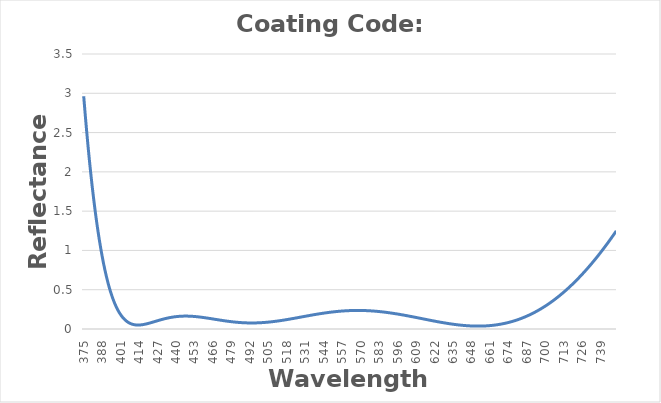
| Category | Reflectance |
|---|---|
| 375.0 | 2.962 |
| 376.0 | 2.742 |
| 377.0 | 2.533 |
| 378.0 | 2.336 |
| 379.0 | 2.15 |
| 380.0 | 1.975 |
| 381.0 | 1.81 |
| 382.0 | 1.656 |
| 383.0 | 1.512 |
| 384.0 | 1.377 |
| 385.0 | 1.251 |
| 386.0 | 1.134 |
| 387.0 | 1.025 |
| 388.0 | 0.925 |
| 389.0 | 0.831 |
| 390.0 | 0.746 |
| 391.0 | 0.667 |
| 392.0 | 0.594 |
| 393.0 | 0.528 |
| 394.0 | 0.468 |
| 395.0 | 0.413 |
| 396.0 | 0.363 |
| 397.0 | 0.318 |
| 398.0 | 0.278 |
| 399.0 | 0.242 |
| 400.0 | 0.21 |
| 401.0 | 0.182 |
| 402.0 | 0.157 |
| 403.0 | 0.136 |
| 404.0 | 0.117 |
| 405.0 | 0.102 |
| 406.0 | 0.089 |
| 407.0 | 0.078 |
| 408.0 | 0.069 |
| 409.0 | 0.062 |
| 410.0 | 0.057 |
| 411.0 | 0.053 |
| 412.0 | 0.051 |
| 413.0 | 0.05 |
| 414.0 | 0.051 |
| 415.0 | 0.052 |
| 416.0 | 0.054 |
| 417.0 | 0.057 |
| 418.0 | 0.06 |
| 419.0 | 0.064 |
| 420.0 | 0.069 |
| 421.0 | 0.074 |
| 422.0 | 0.079 |
| 423.0 | 0.084 |
| 424.0 | 0.089 |
| 425.0 | 0.095 |
| 426.0 | 0.1 |
| 427.0 | 0.105 |
| 428.0 | 0.111 |
| 429.0 | 0.116 |
| 430.0 | 0.121 |
| 431.0 | 0.126 |
| 432.0 | 0.13 |
| 433.0 | 0.135 |
| 434.0 | 0.139 |
| 435.0 | 0.143 |
| 436.0 | 0.146 |
| 437.0 | 0.15 |
| 438.0 | 0.152 |
| 439.0 | 0.155 |
| 440.0 | 0.157 |
| 441.0 | 0.159 |
| 442.0 | 0.161 |
| 443.0 | 0.162 |
| 444.0 | 0.163 |
| 445.0 | 0.164 |
| 446.0 | 0.164 |
| 447.0 | 0.164 |
| 448.0 | 0.164 |
| 449.0 | 0.164 |
| 450.0 | 0.163 |
| 451.0 | 0.162 |
| 452.0 | 0.161 |
| 453.0 | 0.159 |
| 454.0 | 0.158 |
| 455.0 | 0.156 |
| 456.0 | 0.154 |
| 457.0 | 0.152 |
| 458.0 | 0.149 |
| 459.0 | 0.147 |
| 460.0 | 0.144 |
| 461.0 | 0.142 |
| 462.0 | 0.139 |
| 463.0 | 0.136 |
| 464.0 | 0.133 |
| 465.0 | 0.131 |
| 466.0 | 0.128 |
| 467.0 | 0.125 |
| 468.0 | 0.122 |
| 469.0 | 0.119 |
| 470.0 | 0.116 |
| 471.0 | 0.113 |
| 472.0 | 0.11 |
| 473.0 | 0.108 |
| 474.0 | 0.105 |
| 475.0 | 0.102 |
| 476.0 | 0.1 |
| 477.0 | 0.097 |
| 478.0 | 0.095 |
| 479.0 | 0.093 |
| 480.0 | 0.091 |
| 481.0 | 0.089 |
| 482.0 | 0.087 |
| 483.0 | 0.085 |
| 484.0 | 0.084 |
| 485.0 | 0.082 |
| 486.0 | 0.081 |
| 487.0 | 0.08 |
| 488.0 | 0.079 |
| 489.0 | 0.078 |
| 490.0 | 0.078 |
| 491.0 | 0.077 |
| 492.0 | 0.077 |
| 493.0 | 0.077 |
| 494.0 | 0.077 |
| 495.0 | 0.077 |
| 496.0 | 0.078 |
| 497.0 | 0.078 |
| 498.0 | 0.079 |
| 499.0 | 0.08 |
| 500.0 | 0.08 |
| 501.0 | 0.082 |
| 502.0 | 0.083 |
| 503.0 | 0.084 |
| 504.0 | 0.086 |
| 505.0 | 0.088 |
| 506.0 | 0.089 |
| 507.0 | 0.091 |
| 508.0 | 0.093 |
| 509.0 | 0.096 |
| 510.0 | 0.098 |
| 511.0 | 0.1 |
| 512.0 | 0.103 |
| 513.0 | 0.105 |
| 514.0 | 0.108 |
| 515.0 | 0.111 |
| 516.0 | 0.114 |
| 517.0 | 0.117 |
| 518.0 | 0.12 |
| 519.0 | 0.123 |
| 520.0 | 0.126 |
| 521.0 | 0.129 |
| 522.0 | 0.132 |
| 523.0 | 0.135 |
| 524.0 | 0.139 |
| 525.0 | 0.142 |
| 526.0 | 0.145 |
| 527.0 | 0.149 |
| 528.0 | 0.152 |
| 529.0 | 0.155 |
| 530.0 | 0.159 |
| 531.0 | 0.162 |
| 532.0 | 0.165 |
| 533.0 | 0.169 |
| 534.0 | 0.172 |
| 535.0 | 0.175 |
| 536.0 | 0.178 |
| 537.0 | 0.182 |
| 538.0 | 0.185 |
| 539.0 | 0.188 |
| 540.0 | 0.191 |
| 541.0 | 0.194 |
| 542.0 | 0.196 |
| 543.0 | 0.199 |
| 544.0 | 0.202 |
| 545.0 | 0.205 |
| 546.0 | 0.207 |
| 547.0 | 0.21 |
| 548.0 | 0.212 |
| 549.0 | 0.214 |
| 550.0 | 0.216 |
| 551.0 | 0.218 |
| 552.0 | 0.22 |
| 553.0 | 0.222 |
| 554.0 | 0.224 |
| 555.0 | 0.226 |
| 556.0 | 0.227 |
| 557.0 | 0.229 |
| 558.0 | 0.23 |
| 559.0 | 0.231 |
| 560.0 | 0.232 |
| 561.0 | 0.233 |
| 562.0 | 0.234 |
| 563.0 | 0.235 |
| 564.0 | 0.235 |
| 565.0 | 0.236 |
| 566.0 | 0.236 |
| 567.0 | 0.236 |
| 568.0 | 0.236 |
| 569.0 | 0.236 |
| 570.0 | 0.236 |
| 571.0 | 0.236 |
| 572.0 | 0.235 |
| 573.0 | 0.235 |
| 574.0 | 0.234 |
| 575.0 | 0.233 |
| 576.0 | 0.232 |
| 577.0 | 0.231 |
| 578.0 | 0.23 |
| 579.0 | 0.229 |
| 580.0 | 0.227 |
| 581.0 | 0.226 |
| 582.0 | 0.224 |
| 583.0 | 0.222 |
| 584.0 | 0.22 |
| 585.0 | 0.218 |
| 586.0 | 0.216 |
| 587.0 | 0.214 |
| 588.0 | 0.212 |
| 589.0 | 0.209 |
| 590.0 | 0.207 |
| 591.0 | 0.204 |
| 592.0 | 0.202 |
| 593.0 | 0.199 |
| 594.0 | 0.196 |
| 595.0 | 0.193 |
| 596.0 | 0.19 |
| 597.0 | 0.187 |
| 598.0 | 0.184 |
| 599.0 | 0.181 |
| 600.0 | 0.178 |
| 601.0 | 0.175 |
| 602.0 | 0.171 |
| 603.0 | 0.168 |
| 604.0 | 0.164 |
| 605.0 | 0.161 |
| 606.0 | 0.157 |
| 607.0 | 0.154 |
| 608.0 | 0.15 |
| 609.0 | 0.147 |
| 610.0 | 0.143 |
| 611.0 | 0.14 |
| 612.0 | 0.136 |
| 613.0 | 0.132 |
| 614.0 | 0.129 |
| 615.0 | 0.125 |
| 616.0 | 0.122 |
| 617.0 | 0.118 |
| 618.0 | 0.114 |
| 619.0 | 0.111 |
| 620.0 | 0.107 |
| 621.0 | 0.104 |
| 622.0 | 0.1 |
| 623.0 | 0.097 |
| 624.0 | 0.094 |
| 625.0 | 0.09 |
| 626.0 | 0.087 |
| 627.0 | 0.084 |
| 628.0 | 0.081 |
| 629.0 | 0.078 |
| 630.0 | 0.075 |
| 631.0 | 0.072 |
| 632.0 | 0.069 |
| 633.0 | 0.066 |
| 634.0 | 0.063 |
| 635.0 | 0.061 |
| 636.0 | 0.058 |
| 637.0 | 0.056 |
| 638.0 | 0.054 |
| 639.0 | 0.052 |
| 640.0 | 0.05 |
| 641.0 | 0.048 |
| 642.0 | 0.046 |
| 643.0 | 0.045 |
| 644.0 | 0.043 |
| 645.0 | 0.042 |
| 646.0 | 0.041 |
| 647.0 | 0.04 |
| 648.0 | 0.039 |
| 649.0 | 0.038 |
| 650.0 | 0.037 |
| 651.0 | 0.037 |
| 652.0 | 0.037 |
| 653.0 | 0.037 |
| 654.0 | 0.037 |
| 655.0 | 0.037 |
| 656.0 | 0.038 |
| 657.0 | 0.038 |
| 658.0 | 0.039 |
| 659.0 | 0.04 |
| 660.0 | 0.042 |
| 661.0 | 0.043 |
| 662.0 | 0.045 |
| 663.0 | 0.047 |
| 664.0 | 0.049 |
| 665.0 | 0.051 |
| 666.0 | 0.054 |
| 667.0 | 0.057 |
| 668.0 | 0.06 |
| 669.0 | 0.063 |
| 670.0 | 0.066 |
| 671.0 | 0.07 |
| 672.0 | 0.074 |
| 673.0 | 0.078 |
| 674.0 | 0.083 |
| 675.0 | 0.087 |
| 676.0 | 0.092 |
| 677.0 | 0.098 |
| 678.0 | 0.103 |
| 679.0 | 0.109 |
| 680.0 | 0.115 |
| 681.0 | 0.121 |
| 682.0 | 0.127 |
| 683.0 | 0.134 |
| 684.0 | 0.141 |
| 685.0 | 0.148 |
| 686.0 | 0.156 |
| 687.0 | 0.164 |
| 688.0 | 0.172 |
| 689.0 | 0.18 |
| 690.0 | 0.189 |
| 691.0 | 0.198 |
| 692.0 | 0.207 |
| 693.0 | 0.217 |
| 694.0 | 0.227 |
| 695.0 | 0.237 |
| 696.0 | 0.247 |
| 697.0 | 0.258 |
| 698.0 | 0.269 |
| 699.0 | 0.28 |
| 700.0 | 0.292 |
| 701.0 | 0.303 |
| 702.0 | 0.316 |
| 703.0 | 0.328 |
| 704.0 | 0.341 |
| 705.0 | 0.354 |
| 706.0 | 0.367 |
| 707.0 | 0.381 |
| 708.0 | 0.395 |
| 709.0 | 0.409 |
| 710.0 | 0.423 |
| 711.0 | 0.438 |
| 712.0 | 0.453 |
| 713.0 | 0.469 |
| 714.0 | 0.485 |
| 715.0 | 0.501 |
| 716.0 | 0.517 |
| 717.0 | 0.534 |
| 718.0 | 0.551 |
| 719.0 | 0.568 |
| 720.0 | 0.585 |
| 721.0 | 0.603 |
| 722.0 | 0.621 |
| 723.0 | 0.64 |
| 724.0 | 0.658 |
| 725.0 | 0.677 |
| 726.0 | 0.697 |
| 727.0 | 0.716 |
| 728.0 | 0.736 |
| 729.0 | 0.757 |
| 730.0 | 0.777 |
| 731.0 | 0.798 |
| 732.0 | 0.819 |
| 733.0 | 0.84 |
| 734.0 | 0.862 |
| 735.0 | 0.884 |
| 736.0 | 0.906 |
| 737.0 | 0.929 |
| 738.0 | 0.952 |
| 739.0 | 0.975 |
| 740.0 | 0.998 |
| 741.0 | 1.022 |
| 742.0 | 1.046 |
| 743.0 | 1.07 |
| 744.0 | 1.095 |
| 745.0 | 1.12 |
| 746.0 | 1.145 |
| 747.0 | 1.17 |
| 748.0 | 1.196 |
| 749.0 | 1.222 |
| 750.0 | 1.248 |